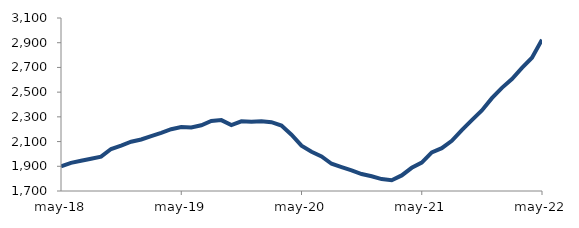
| Category | Series 0 |
|---|---|
| 2018-05-01 | 1900.168 |
| 2018-06-01 | 1927.991 |
| 2018-07-01 | 1944.508 |
| 2018-08-01 | 1961.029 |
| 2018-09-01 | 1978.317 |
| 2018-10-01 | 2039.821 |
| 2018-11-01 | 2068.002 |
| 2018-12-01 | 2098.706 |
| 2019-01-01 | 2116.727 |
| 2019-02-01 | 2144.876 |
| 2019-03-01 | 2171.077 |
| 2019-04-01 | 2199.941 |
| 2019-05-01 | 2218.125 |
| 2019-06-01 | 2213.708 |
| 2019-07-01 | 2231.834 |
| 2019-08-01 | 2267.321 |
| 2019-09-01 | 2273.768 |
| 2019-10-01 | 2233.304 |
| 2019-11-01 | 2263.898 |
| 2019-12-01 | 2259.926 |
| 2020-01-01 | 2265.053 |
| 2020-02-01 | 2256.766 |
| 2020-03-01 | 2229.161 |
| 2020-04-01 | 2155.791 |
| 2020-05-01 | 2066.843 |
| 2020-06-01 | 2018.026 |
| 2020-07-01 | 1979.558 |
| 2020-08-01 | 1920.368 |
| 2020-09-01 | 1893.237 |
| 2020-10-01 | 1867.4 |
| 2020-11-01 | 1837.195 |
| 2020-12-01 | 1819.546 |
| 2021-01-01 | 1796.45 |
| 2021-02-01 | 1786.603 |
| 2021-03-01 | 1826.072 |
| 2021-04-01 | 1887.798 |
| 2021-05-01 | 1930.372 |
| 2021-06-01 | 2012.926 |
| 2021-07-01 | 2046.434 |
| 2021-08-01 | 2105.806 |
| 2021-09-01 | 2192.514 |
| 2021-10-01 | 2272.972 |
| 2021-11-01 | 2351.334 |
| 2021-12-01 | 2451.171 |
| 2022-01-01 | 2534.613 |
| 2022-02-01 | 2606.357 |
| 2022-03-01 | 2696.948 |
| 2022-04-01 | 2778.264 |
| 2022-05-01 | 2924.682 |